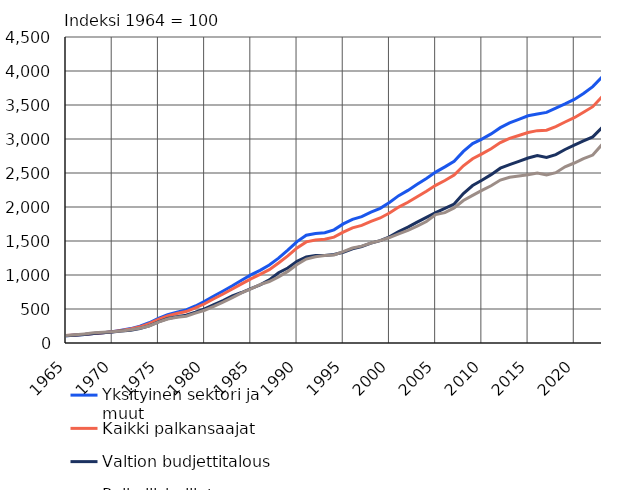
| Category | Yksityinen sektori ja muut | Kaikki palkansaajat | Valtion budjettitalous | Paikallishallinto |
|---|---|---|---|---|
| 1965 | 108 | 108.6 | 107 | 112 |
| 1966 | 116 | 116.5 | 115 | 122 |
| 1967 | 126 | 126.8 | 126 | 134 |
| 1968 | 139 | 140.8 | 141 | 149 |
| 1969 | 150 | 151.2 | 151 | 158 |
| 1970 | 164 | 163.9 | 161 | 165 |
| 1971 | 188 | 184.8 | 176 | 178 |
| 1972 | 212 | 206.3 | 189 | 194 |
| 1973 | 247 | 238 | 213 | 217 |
| 1974 | 298 | 284.8 | 252 | 250 |
| 1975 | 362 | 347.2 | 312 | 307 |
| 1976 | 416 | 399.1 | 360 | 353 |
| 1977 | 453 | 432.9 | 387 | 378 |
| 1978 | 487 | 462.4 | 408 | 394 |
| 1979 | 544 | 515.3 | 452 | 439 |
| 1980 | 612 | 577.3 | 502 | 482 |
| 1981 | 692 | 651 | 565 | 538 |
| 1982 | 765 | 719.9 | 624 | 600 |
| 1983 | 840.9 | 794.5 | 692.8 | 667.7 |
| 1984 | 921.8 | 869.5 | 742.3 | 738.3 |
| 1985 | 1001.4 | 942.7 | 801.3 | 795.1 |
| 1986 | 1068.8 | 1008.4 | 855.3 | 859.6 |
| 1987 | 1146.6 | 1079.3 | 928 | 904.4 |
| 1988 | 1248.2 | 1176.2 | 1033 | 972.2 |
| 1989 | 1366.4 | 1280.6 | 1102.1 | 1052.9 |
| 1990 | 1490.8 | 1398.2 | 1201.5 | 1154 |
| 1991 | 1585.1 | 1487 | 1267.1 | 1234.2 |
| 1992 | 1611.4 | 1515.2 | 1288.3 | 1269.1 |
| 1993 | 1621.8 | 1526.2 | 1287.8 | 1285.8 |
| 1994 | 1663.5 | 1556.7 | 1302.4 | 1294.8 |
| 1995 | 1751.7 | 1629.4 | 1334.2 | 1343 |
| 1996 | 1819 | 1693 | 1386 | 1397 |
| 1997 | 1859 | 1730 | 1419 | 1424 |
| 1998 | 1925 | 1789 | 1469 | 1471 |
| 1999 | 1981 | 1839 | 1505 | 1506 |
| 2000 | 2067 | 1912 | 1560 | 1551 |
| 2001 | 2167 | 1999 | 1639 | 1606 |
| 2002 | 2244 | 2069 | 1704 | 1657 |
| 2003 | 2333 | 2151 | 1777 | 1718 |
| 2004 | 2419 | 2232 | 1848 | 1786 |
| 2005 | 2513 | 2319 | 1916 | 1888 |
| 2006 | 2590 | 2390 | 1981 | 1917 |
| 2007 | 2673 | 2469 | 2044 | 1986 |
| 2008 | 2818 | 2606 | 2198 | 2096 |
| 2009 | 2932 | 2710 | 2316 | 2170 |
| 2010 | 2999 | 2781 | 2393 | 2245 |
| 2011 | 3075 | 2856 | 2476 | 2312 |
| 2012 | 3167 | 2947 | 2571 | 2396 |
| 2013 | 3237 | 3009 | 2622 | 2438 |
| 2014 | 3290 | 3052 | 2672 | 2455 |
| 2015 | 3341 | 3095 | 2720 | 2475 |
| 2016 | 3367 | 3123 | 2757 | 2498 |
| 2017 | 3391 | 3130 | 2730 | 2472 |
| 2018 | 3455 | 3183 | 2771 | 2505 |
| 2019 | 3515.589 | 3250 | 2845.381 | 2591.118 |
| 2020 | 3582 | 3313 | 2909 | 2647 |
| 2021 | 3669 | 3393 | 2971 | 2710 |
| 2022 | 3770.941 | 3475 | 3030.565 | 2763.485 |
| 2023* | 3911.9 | 3622 | 3166.6 | 2918.5 |